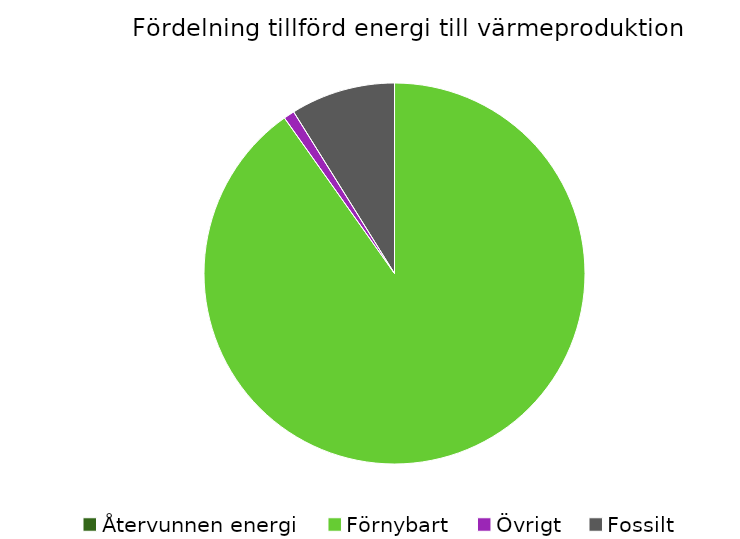
| Category | Fördelning värmeproduktion |
|---|---|
| Återvunnen energi | 0 |
| Förnybart | 0.902 |
| Övrigt | 0.009 |
| Fossilt | 0.089 |